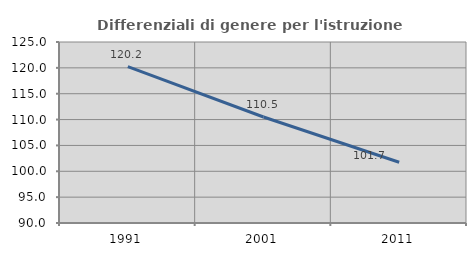
| Category | Differenziali di genere per l'istruzione superiore |
|---|---|
| 1991.0 | 120.238 |
| 2001.0 | 110.499 |
| 2011.0 | 101.742 |